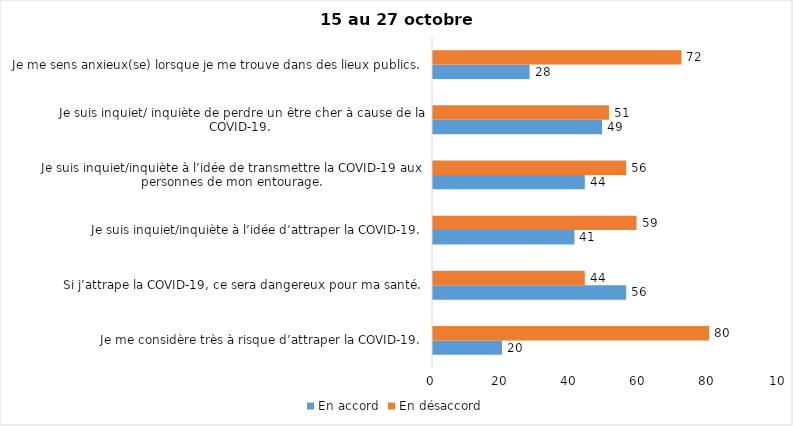
| Category | En accord | En désaccord |
|---|---|---|
| Je me considère très à risque d’attraper la COVID-19. | 20 | 80 |
| Si j’attrape la COVID-19, ce sera dangereux pour ma santé. | 56 | 44 |
| Je suis inquiet/inquiète à l’idée d’attraper la COVID-19. | 41 | 59 |
| Je suis inquiet/inquiète à l’idée de transmettre la COVID-19 aux personnes de mon entourage. | 44 | 56 |
| Je suis inquiet/ inquiète de perdre un être cher à cause de la COVID-19. | 49 | 51 |
| Je me sens anxieux(se) lorsque je me trouve dans des lieux publics. | 28 | 72 |